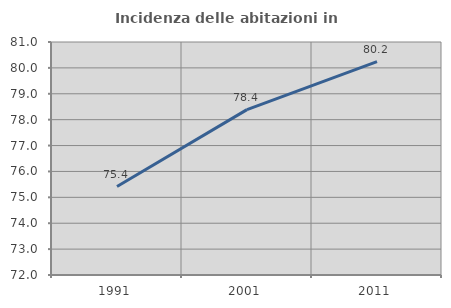
| Category | Incidenza delle abitazioni in proprietà  |
|---|---|
| 1991.0 | 75.415 |
| 2001.0 | 78.387 |
| 2011.0 | 80.24 |